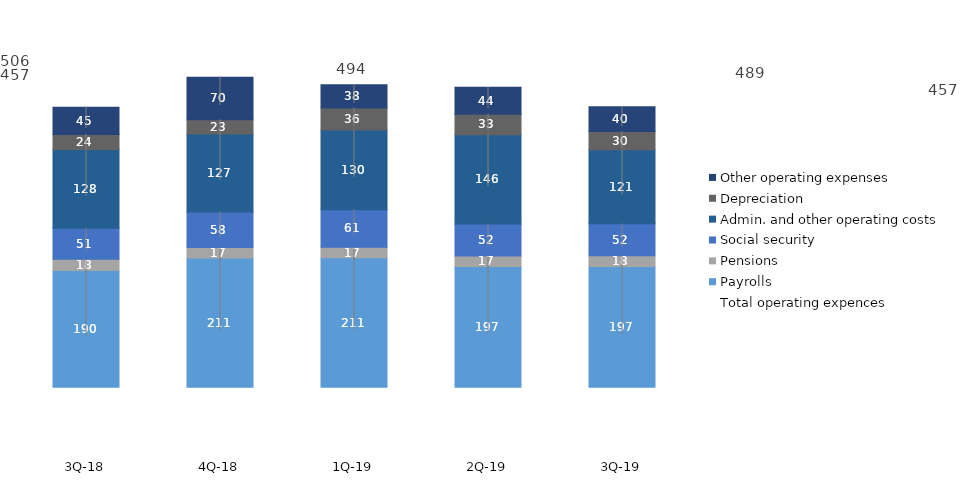
| Category | Payrolls | Pensions | Social security | Admin. and other operating costs | Depreciation | Other operating expenses |
|---|---|---|---|---|---|---|
| 3Q-19 | 197.115 | 17.531 | 51.896 | 120.883 | 29.827 | 40.201 |
| 2Q-19 | 196.87 | 17.26 | 52.39 | 145.58 | 33.35 | 43.87 |
| 1Q-19 | 211.174 | 17.185 | 61.24 | 130.252 | 35.543 | 38.331 |
| 4Q-18 | 210.902 | 16.926 | 58.219 | 127.179 | 23.057 | 69.672 |
| 3Q-18 | 190.273 | 18.438 | 50.778 | 128.41 | 24.363 | 44.712 |